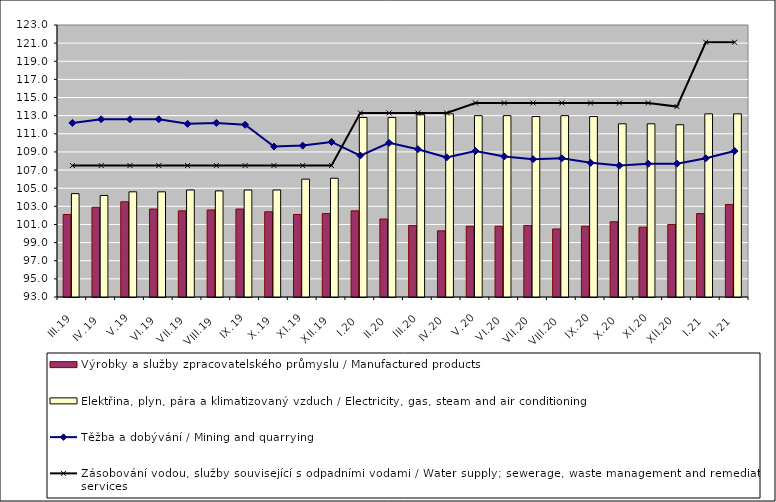
| Category | Výrobky a služby zpracovatelského průmyslu / Manufactured products | Elektřina, plyn, pára a klimatizovaný vzduch / Electricity, gas, steam and air conditioning |
|---|---|---|
| III.19 | 102.1 | 104.4 |
| IV.19 | 102.9 | 104.2 |
| V.19 | 103.5 | 104.6 |
| VI.19 | 102.7 | 104.6 |
| VII.19 | 102.5 | 104.8 |
| VIII.19 | 102.6 | 104.7 |
| IX.19 | 102.7 | 104.8 |
| X.19 | 102.4 | 104.8 |
| XI.19 | 102.1 | 106 |
| XII.19 | 102.2 | 106.1 |
| I.20 | 102.5 | 112.8 |
| II.20 | 101.6 | 112.8 |
| III.20 | 100.9 | 113.1 |
| IV.20 | 100.3 | 113.2 |
| V.20 | 100.8 | 113 |
| VI.20 | 100.8 | 113 |
| VII.20 | 100.9 | 112.9 |
| VIII.20 | 100.5 | 113 |
| IX.20 | 100.8 | 112.9 |
| X.20 | 101.3 | 112.1 |
| XI.20 | 100.7 | 112.1 |
| XII.20 | 101 | 112 |
| I.21 | 102.2 | 113.2 |
| II.21 | 103.2 | 113.2 |